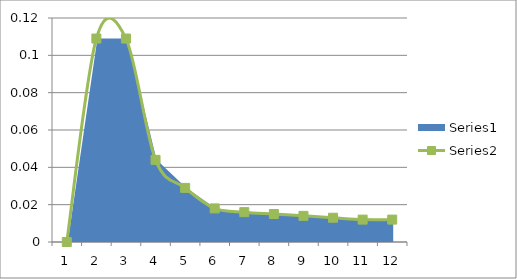
| Category | Series 0 |
|---|---|
| 0 | 0 |
| 1 | 0.109 |
| 2 | 0.109 |
| 3 | 0.044 |
| 4 | 0.029 |
| 5 | 0.018 |
| 6 | 0.016 |
| 7 | 0.015 |
| 8 | 0.014 |
| 9 | 0.013 |
| 10 | 0.012 |
| 11 | 0.012 |